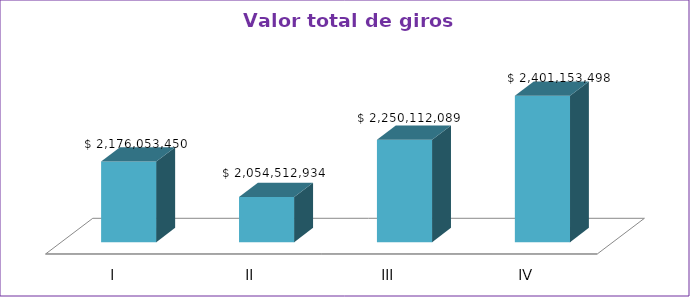
| Category | Series 0 |
|---|---|
| I | 2176053450 |
| II | 2054512934 |
| III | 2250112089 |
| IV | 2401153498 |